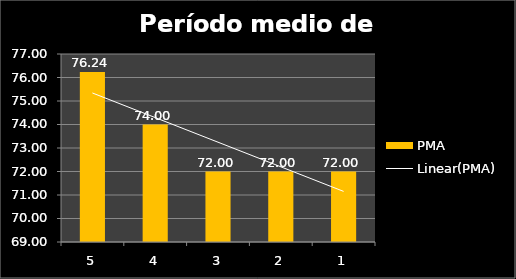
| Category | PMA |
|---|---|
| 5.0 | 76.235 |
| 4.0 | 74 |
| 3.0 | 72 |
| 2.0 | 72 |
| 1.0 | 72 |